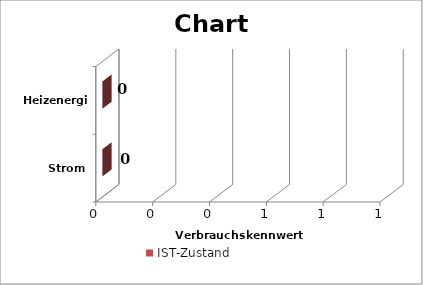
| Category | Vergleichswert | IST-Zustand |
|---|---|---|
| Strom |  | 0 |
| Heizenergie |  | 0 |